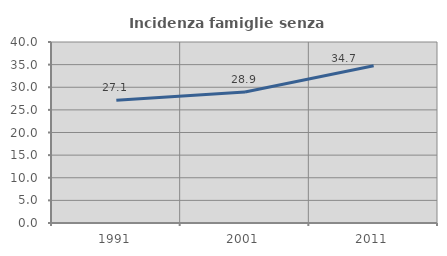
| Category | Incidenza famiglie senza nuclei |
|---|---|
| 1991.0 | 27.123 |
| 2001.0 | 28.933 |
| 2011.0 | 34.743 |